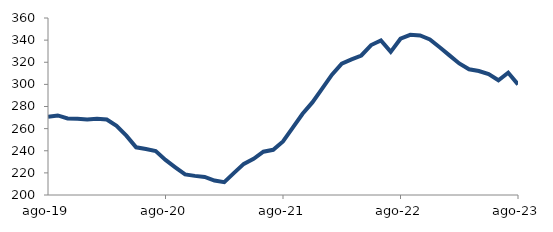
| Category | Series 0 |
|---|---|
| 2019-08-01 | 270.617 |
| 2019-09-01 | 271.909 |
| 2019-10-01 | 269.246 |
| 2019-11-01 | 268.873 |
| 2019-12-01 | 268.319 |
| 2020-01-01 | 268.914 |
| 2020-02-01 | 268.233 |
| 2020-03-01 | 262.58 |
| 2020-04-01 | 253.663 |
| 2020-05-01 | 243.088 |
| 2020-06-01 | 241.541 |
| 2020-07-01 | 239.786 |
| 2020-08-01 | 231.766 |
| 2020-09-01 | 225.047 |
| 2020-10-01 | 218.571 |
| 2020-11-01 | 217.286 |
| 2020-12-01 | 216.368 |
| 2021-01-01 | 213.087 |
| 2021-02-01 | 211.643 |
| 2021-03-01 | 220.04 |
| 2021-04-01 | 228.12 |
| 2021-05-01 | 232.717 |
| 2021-06-01 | 239.097 |
| 2021-07-01 | 240.846 |
| 2021-08-01 | 248.449 |
| 2021-09-01 | 260.934 |
| 2021-10-01 | 273.441 |
| 2021-11-01 | 283.683 |
| 2021-12-01 | 296.134 |
| 2022-01-01 | 308.804 |
| 2022-02-01 | 318.726 |
| 2022-03-01 | 322.592 |
| 2022-04-01 | 326.114 |
| 2022-05-01 | 335.557 |
| 2022-06-01 | 339.684 |
| 2022-07-01 | 329.357 |
| 2022-08-01 | 341.293 |
| 2022-09-01 | 344.793 |
| 2022-10-01 | 344.185 |
| 2022-11-01 | 340.608 |
| 2022-12-01 | 333.559 |
| 2023-01-01 | 326.199 |
| 2023-02-01 | 318.915 |
| 2023-03-01 | 313.615 |
| 2023-04-01 | 312.076 |
| 2023-05-01 | 309.232 |
| 2023-06-01 | 303.714 |
| 2023-07-01 | 310.493 |
| 2023-08-01 | 299.987 |